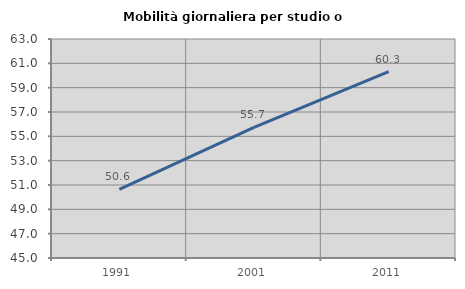
| Category | Mobilità giornaliera per studio o lavoro |
|---|---|
| 1991.0 | 50.638 |
| 2001.0 | 55.741 |
| 2011.0 | 60.317 |